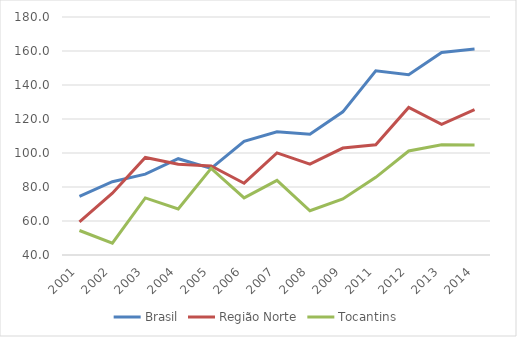
| Category | Brasil | Região Norte | Tocantins |
|---|---|---|---|
| 2001.0 | 74.53 | 59.521 | 54.403 |
| 2002.0 | 83.092 | 76.341 | 46.998 |
| 2003.0 | 87.545 | 97.373 | 73.586 |
| 2004.0 | 96.651 | 93.349 | 67.11 |
| 2005.0 | 90.93 | 92.425 | 90.939 |
| 2006.0 | 106.812 | 82.229 | 73.633 |
| 2007.0 | 112.466 | 100.028 | 83.909 |
| 2008.0 | 111.013 | 93.466 | 66.022 |
| 2009.0 | 124.225 | 102.915 | 72.946 |
| 2011.0 | 148.383 | 104.804 | 85.699 |
| 2012.0 | 146.057 | 126.788 | 101.17 |
| 2013.0 | 159.169 | 116.842 | 104.789 |
| 2014.0 | 161.157 | 125.537 | 104.683 |